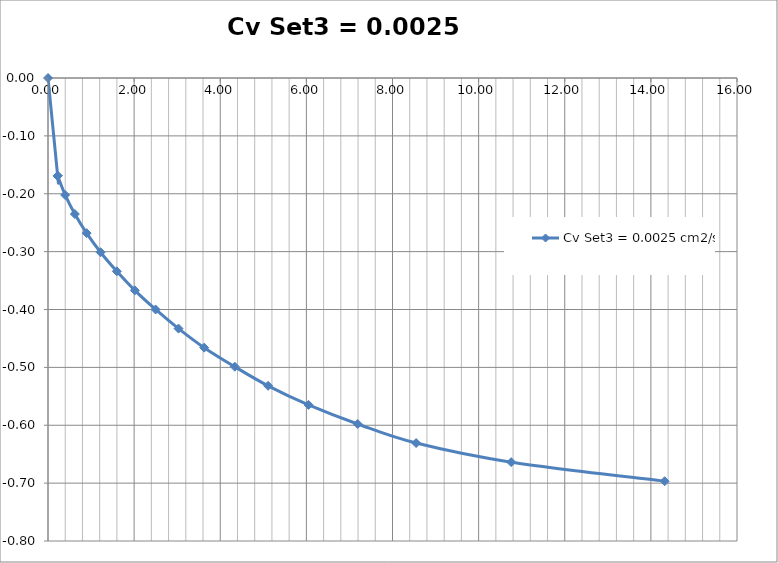
| Category | Cv Set3 = 0.0025 cm2/sec |
|---|---|
| 0.0 | 0 |
| 0.22450532724505326 | -0.169 |
| 0.22450532724505326 | -0.169 |
| 0.22450532724505326 | -0.169 |
| 0.3982749873160832 | -0.202 |
| 0.6227803145611365 | -0.235 |
| 0.8967529173008626 | -0.268 |
| 1.2201927955352614 | -0.301 |
| 1.5981735159817352 | -0.334 |
| 2.0167427701674274 | -0.367 |
| 2.4987316083206497 | -0.4 |
| 3.0314561136478946 | -0.433 |
| 3.627600202942669 | -0.466 |
| 4.337899543378995 | -0.499 |
| 5.111618467782851 | -0.532 |
| 6.050228310502283 | -0.565 |
| 7.191780821917808 | -0.598 |
| 8.548959918822932 | -0.631 |
| 10.755961440892948 | -0.664 |
| 14.320142059868088 | -0.697 |